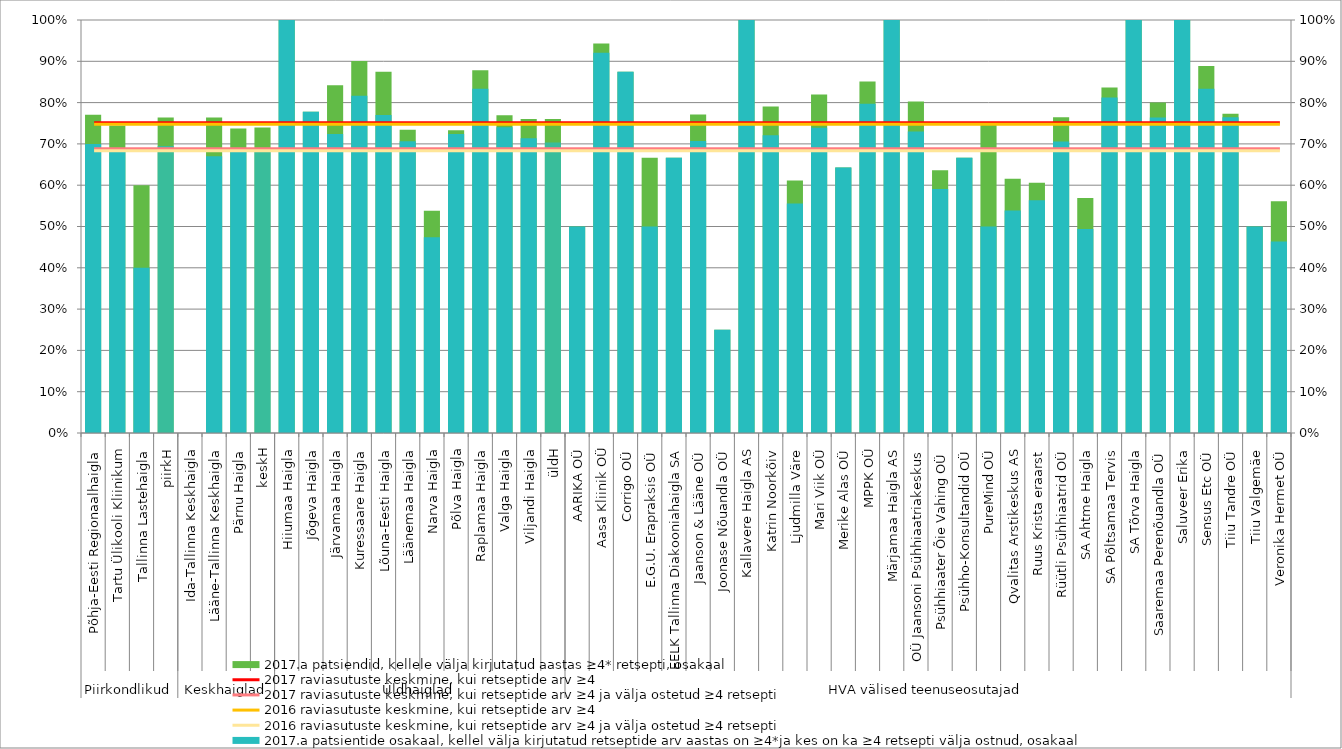
| Category | 2017.a patsiendid, kellele välja kirjutatud aastas ≥4* retsepti, osakaal |
|---|---|
| 0 | 0.771 |
| 1 | 0.745 |
| 2 | 0.6 |
| 3 | 0.764 |
| 4 | 0 |
| 5 | 0.764 |
| 6 | 0.737 |
| 7 | 0.74 |
| 8 | 1 |
| 9 | 0.778 |
| 10 | 0.842 |
| 11 | 0.901 |
| 12 | 0.875 |
| 13 | 0.734 |
| 14 | 0.538 |
| 15 | 0.733 |
| 16 | 0.878 |
| 17 | 0.769 |
| 18 | 0.76 |
| 19 | 0.76 |
| 20 | 0.5 |
| 21 | 0.943 |
| 22 | 0.875 |
| 23 | 0.667 |
| 24 | 0.667 |
| 25 | 0.771 |
| 26 | 0.25 |
| 27 | 1 |
| 28 | 0.791 |
| 29 | 0.611 |
| 30 | 0.82 |
| 31 | 0.643 |
| 32 | 0.851 |
| 33 | 1 |
| 34 | 0.803 |
| 35 | 0.636 |
| 36 | 0.667 |
| 37 | 0.75 |
| 38 | 0.615 |
| 39 | 0.606 |
| 40 | 0.765 |
| 41 | 0.569 |
| 42 | 0.836 |
| 43 | 1 |
| 44 | 0.8 |
| 45 | 1 |
| 46 | 0.889 |
| 47 | 0.773 |
| 48 | 0.5 |
| 49 | 0.561 |